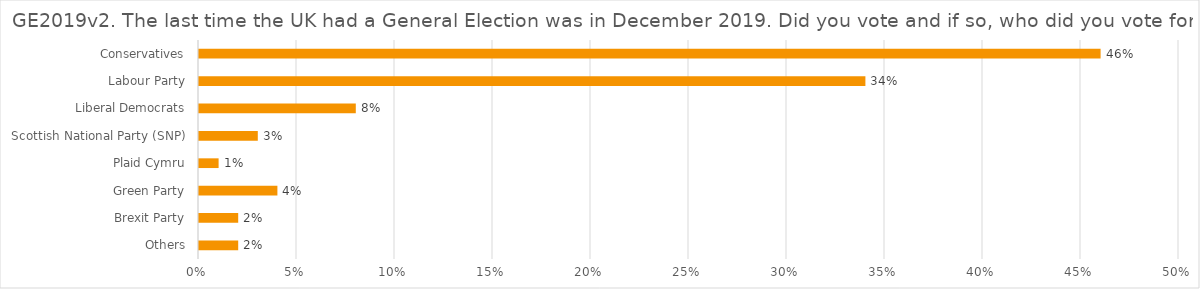
| Category | GE2019v2. The last time the UK had a General Election was in December 2019. Did you vote and if so, who did you vote for? |
|---|---|
| Others | 0.02 |
| Brexit Party | 0.02 |
| Green Party | 0.04 |
| Plaid Cymru | 0.01 |
| Scottish National Party (SNP) | 0.03 |
| Liberal Democrats | 0.08 |
| Labour Party | 0.34 |
| Conservatives | 0.46 |